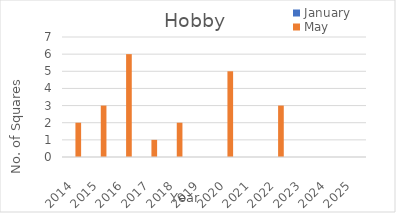
| Category | January | May |
|---|---|---|
| 2014.0 | 0 | 2 |
| 2015.0 | 0 | 3 |
| 2016.0 | 0 | 6 |
| 2017.0 | 0 | 1 |
| 2018.0 | 0 | 2 |
| 2019.0 | 0 | 0 |
| 2020.0 | 0 | 5 |
| 2021.0 | 0 | 0 |
| 2022.0 | 0 | 3 |
| 2023.0 | 0 | 0 |
| 2024.0 | 0 | 0 |
| 2025.0 | 0 | 0 |